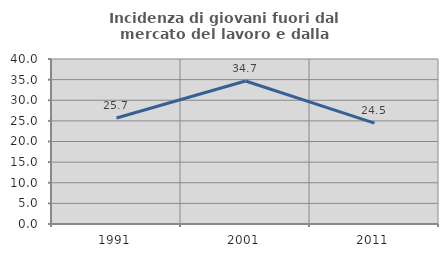
| Category | Incidenza di giovani fuori dal mercato del lavoro e dalla formazione  |
|---|---|
| 1991.0 | 25.7 |
| 2001.0 | 34.655 |
| 2011.0 | 24.457 |